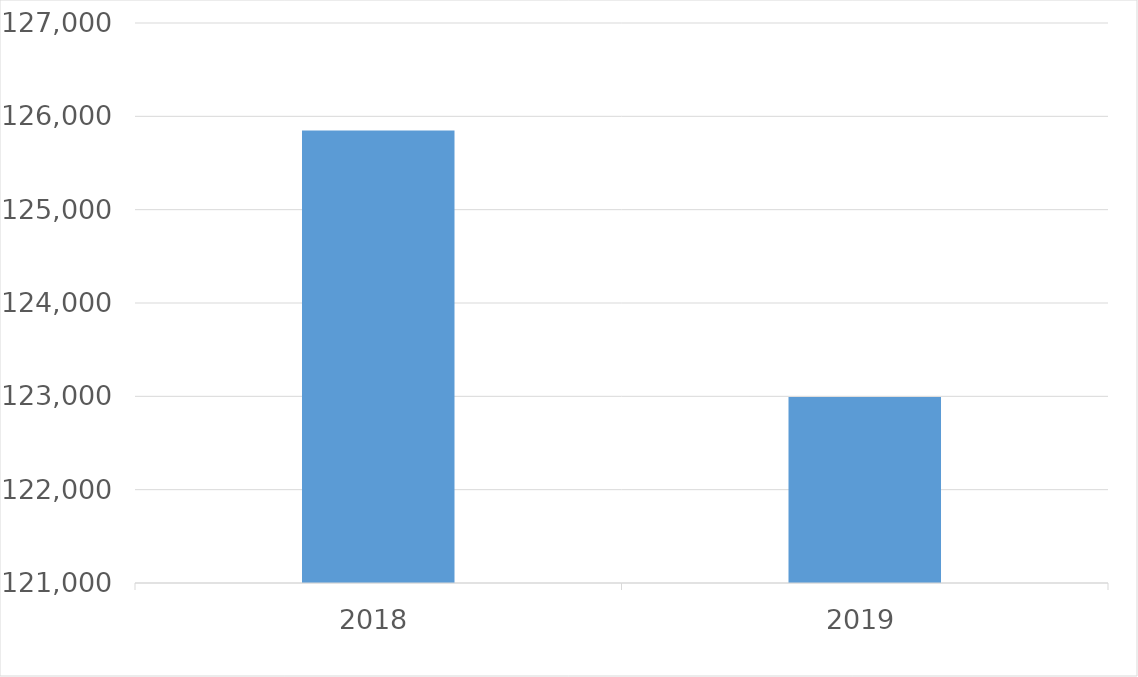
| Category | Series 0 |
|---|---|
| 2018 | 125847 |
| 2019 | 122993 |